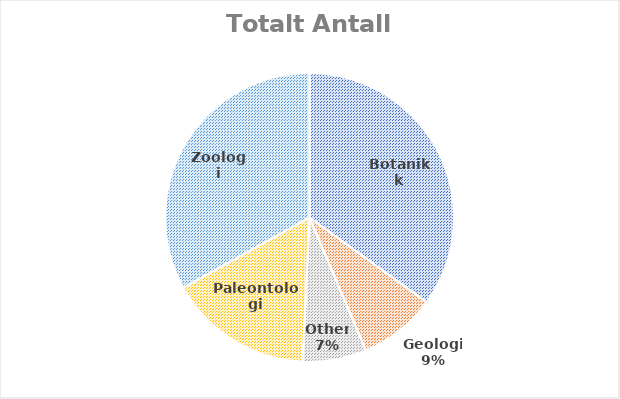
| Category | Totalt Antall artikler |
|---|---|
| Botanikk | 93 |
| Geologi | 23 |
| Other | 19 |
| Paleontologi | 43 |
| Zoologi | 88 |